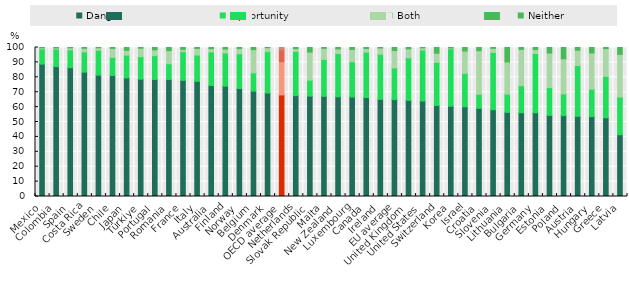
| Category | Danger | Opportunity | Both | Neither |
|---|---|---|---|---|
| Mexico | 88.864 | 10.191 | 0.71 | 0.235 |
| Colombia | 87.187 | 11.749 | 0.743 | 0.322 |
| Spain | 86.437 | 12.006 | 1.288 | 0.269 |
| Costa Rica | 83.452 | 13.502 | 2.517 | 0.528 |
| Sweden | 81.405 | 16.746 | 1.631 | 0.217 |
| Chile | 81.215 | 12.14 | 6.055 | 0.59 |
| Japan | 79.579 | 15.315 | 3.167 | 1.938 |
| Türkiye | 78.723 | 15.131 | 5.683 | 0.464 |
| Portugal | 78.572 | 15.974 | 3.898 | 1.555 |
| Romania | 78.552 | 10.543 | 8.788 | 2.117 |
| France | 77.938 | 19.322 | 1.511 | 1.229 |
| Italy | 77.312 | 17.627 | 4.43 | 0.631 |
| Australia | 74.477 | 22.518 | 2.221 | 0.785 |
| Finland | 74.042 | 22.26 | 2.651 | 1.048 |
| Norway | 72.454 | 23.351 | 3.546 | 0.649 |
| Belgium | 70.705 | 12.246 | 15.607 | 1.442 |
| Denmark | 69.436 | 27.802 | 2.634 | 0.129 |
| OECD average | 68.162 | 22.328 | 7.831 | 1.679 |
| Netherlands | 67.691 | 29.706 | 1.884 | 0.719 |
| Slovak Republic | 67.382 | 10.741 | 18.774 | 3.103 |
| Malta | 67.237 | 24.744 | 7.479 | 0.541 |
| New Zealand | 66.898 | 29.09 | 3.13 | 0.883 |
| Luxembourg | 66.797 | 23.608 | 8.317 | 1.278 |
| Canada | 66.418 | 30.434 | 2.495 | 0.653 |
| Ireland | 65.22 | 30.262 | 4.185 | 0.333 |
| EU average | 65.015 | 21.219 | 11.693 | 2.073 |
| United Kingdom | 64.53 | 28.538 | 6.034 | 0.898 |
| United States | 64.052 | 34.272 | 1.431 | 0.245 |
| Switzerland | 61.062 | 28.904 | 6.204 | 3.83 |
| Korea | 60.576 | 38.57 | 0.522 | 0.332 |
| Israel | 60.175 | 22.469 | 15.016 | 2.34 |
| Croatia | 59.165 | 9.449 | 29.236 | 2.151 |
| Slovenia | 58.246 | 38.424 | 2.726 | 0.604 |
| Lithuania | 56.432 | 12.244 | 21.654 | 9.669 |
| Bulgaria | 56.248 | 18.112 | 24.393 | 1.248 |
| Germany | 56.19 | 39.759 | 2.665 | 1.386 |
| Estonia | 54.423 | 18.666 | 23.184 | 3.727 |
| Poland | 54.289 | 14.522 | 23.613 | 7.576 |
| Austria | 53.767 | 34.148 | 10.206 | 1.878 |
| Hungary | 53.628 | 18.394 | 24.326 | 3.652 |
| Greece | 52.837 | 27.813 | 18.623 | 0.728 |
| Latvia | 41.42 | 25.359 | 28.626 | 4.595 |